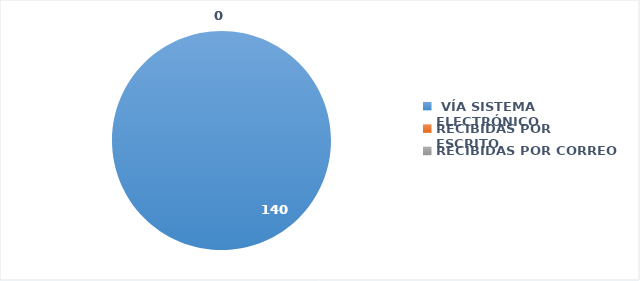
| Category | SOLICITUDES RECIBIDAS |
|---|---|
|  VÍA SISTEMA ELECTRÓNICO | 140 |
| RECIBIDAS POR ESCRITO | 0 |
| RECIBIDAS POR CORREO | 0 |